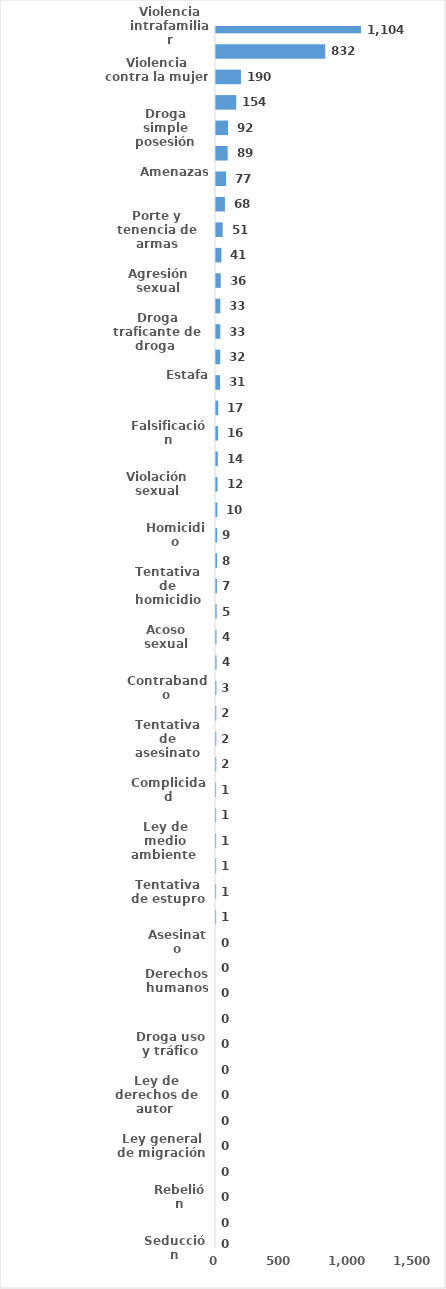
| Category | Series 0 |
|---|---|
| Violencia intrafamiliar | 1104 |
| Robo calificado | 832 |
| Violencia contra la mujer | 190 |
| Código menor NNA | 154 |
| Droga simple posesión | 92 |
| Droga distribución de droga | 89 |
| Amenazas | 77 |
| Golpes y heridas | 68 |
| Porte y tenencia de armas | 51 |
| Abuso de confianza | 41 |
| Agresión sexual | 36 |
| Asociación de malhechores | 33 |
| Droga traficante de droga  | 33 |
| Crímenes y delitos de alta tecnología | 32 |
| Estafa | 31 |
| Daños a la cosa ajena | 17 |
| Falsificación | 16 |
| Trabajo realizado y no pagado | 14 |
| Violación sexual | 12 |
| Incendio | 10 |
| Homicidio | 9 |
| Robo simple | 8 |
| Tentativa de homicidio | 7 |
| Incesto | 5 |
| Acoso sexual | 4 |
| Droga sanciones y circunstancias agravantes | 4 |
| Contrabando | 3 |
| Difamación e injuria | 2 |
| Tentativa de asesinato | 2 |
| Tentativa de robo | 2 |
| Complicidad | 1 |
| Envenenamiento | 1 |
| Ley de medio ambiente  | 1 |
| Ley general de salud | 1 |
| Tentativa de estupro | 1 |
| Tráfico ilícito de migrantes y trata de personas | 1 |
| Asesinato | 0 |
| Código del trabajo | 0 |
| Derechos humanos | 0 |
| Droga delitos y sanciones | 0 |
| Droga uso y tráfico | 0 |
| Lavado de activo | 0 |
| Ley de derechos de autor  | 0 |
| Ley de tránsito | 0 |
| Ley general de migración | 0 |
| Propiedad industrial  | 0 |
| Rebelión | 0 |
| Secuestro | 0 |
| Seducción | 0 |